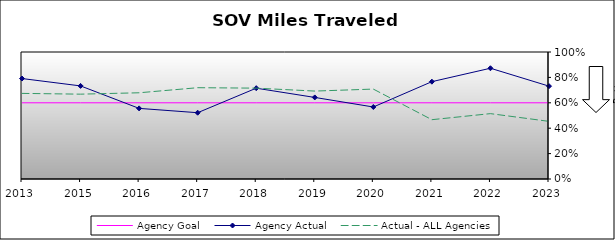
| Category | Agency Goal | Agency Actual | Actual - ALL Agencies |
|---|---|---|---|
| 2013.0 | 0.6 | 0.791 | 0.674 |
| 2015.0 | 0.6 | 0.733 | 0.668 |
| 2016.0 | 0.6 | 0.556 | 0.679 |
| 2017.0 | 0.6 | 0.522 | 0.719 |
| 2018.0 | 0.6 | 0.715 | 0.715 |
| 2019.0 | 0.6 | 0.642 | 0.692 |
| 2020.0 | 0.6 | 0.567 | 0.708 |
| 2021.0 | 0.6 | 0.766 | 0.467 |
| 2022.0 | 0.6 | 0.872 | 0.515 |
| 2023.0 | 0.6 | 0.731 | 0.454 |